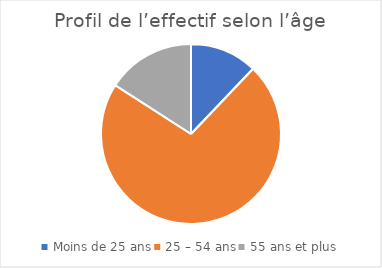
| Category | Series 0 |
|---|---|
| Moins de 25 ans | 12.1 |
| 25 – 54 ans | 72 |
| 55 ans et plus | 15.9 |